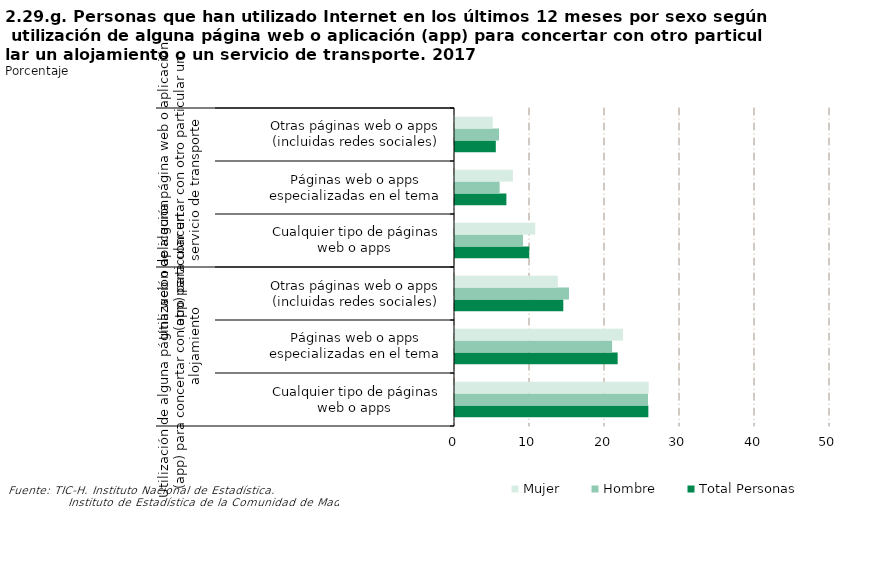
| Category | Total Personas | Hombre | Mujer |
|---|---|---|---|
| 0 | 25.779 | 25.731 | 25.826 |
| 1 | 21.688 | 20.947 | 22.401 |
| 2 | 14.44 | 15.201 | 13.706 |
| 3 | 9.895 | 9.064 | 10.695 |
| 4 | 6.852 | 5.953 | 7.718 |
| 5 | 5.441 | 5.871 | 5.027 |